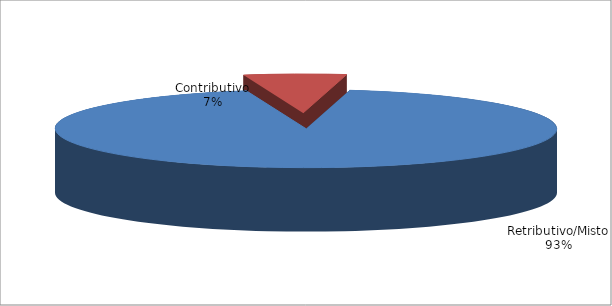
| Category | Series 1 |
|---|---|
| Retributivo/Misto | 168337 |
| Contributivo | 11884 |